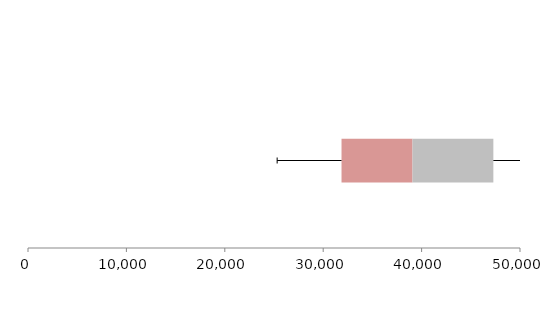
| Category | Series 1 | Series 2 | Series 3 |
|---|---|---|---|
| 0 | 31862.692 | 7213.511 | 8215.611 |